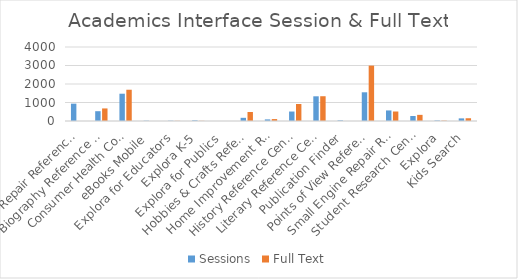
| Category | Sessions | Full Text |
|---|---|---|
| Auto Repair Reference Center | 937 | 0 |
| Biography Reference Center | 530 | 679 |
| Consumer Health Complete | 1475 | 1690 |
| eBooks Mobile | 15 | 1 |
| Explora for Educators | 15 | 9 |
| Explora K-5 | 34 | 9 |
| Explora for Publics | 0 | 0 |
| Hobbies & Crafts Reference Center | 172 | 487 |
| Home Improvement Reference Center | 87 | 104 |
| History Reference Center | 512 | 918 |
| Literary Reference Center / LRC Plus | 1335 | 1339 |
| Publication Finder | 33 | 0 |
| Points of View Reference Center | 1552 | 2994 |
| Small Engine Repair Reference Center | 571 | 513 |
| Student Research Center | 269 | 332 |
| Explora | 28 | 20 |
| Kids Search | 142 | 149 |